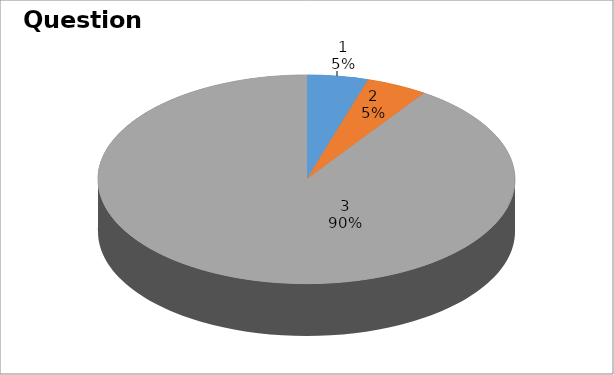
| Category | Series 0 |
|---|---|
| 0 | 1 |
| 1 | 1 |
| 2 | 19 |